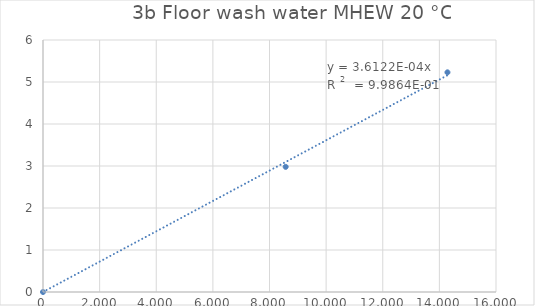
| Category | Series 0 |
|---|---|
| 0.0 | 0 |
| 8571.428571428572 | 2.98 |
| 14285.714285714286 | 5.23 |